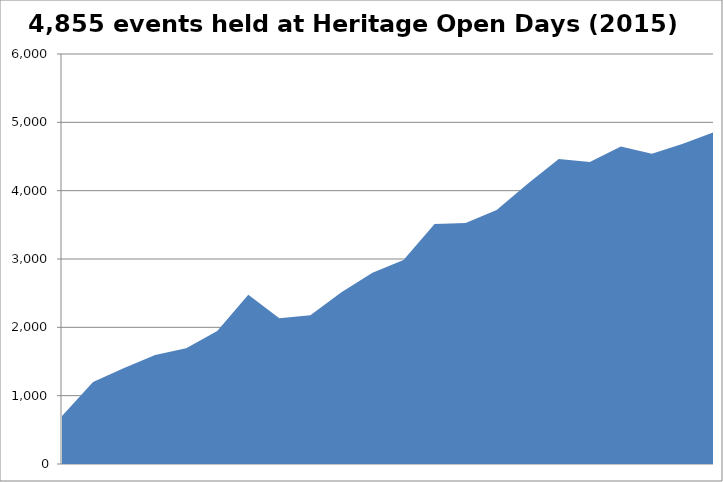
| Category | Number of HODs events  |
|---|---|
| 0 | 701 |
| 1 | 1200 |
| 2 | 1406 |
| 3 | 1596 |
| 4 | 1693 |
| 5 | 1946 |
| 6 | 2478 |
| 7 | 2133 |
| 8 | 2177 |
| 9 | 2512 |
| 10 | 2800 |
| 11 | 2985 |
| 12 | 3512 |
| 13 | 3526 |
| 14 | 3717 |
| 15 | 4100 |
| 16 | 4463 |
| 17 | 4421 |
| 18 | 4648 |
| 19 | 4540 |
| 20 | 4685 |
| 21 | 4855 |